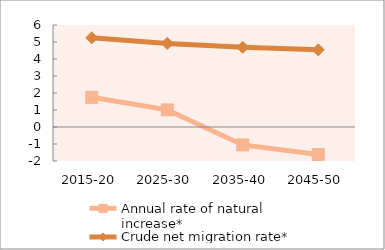
| Category | Annual rate of natural increase* | Crude net migration rate* |
|---|---|---|
| 2015-20 | 1.746 | 5.246 |
| 2025-30 | 1.007 | 4.913 |
| 2035-40 | -1.054 | 4.685 |
| 2045-50 | -1.615 | 4.539 |